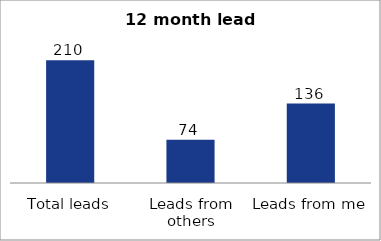
| Category | Series 0 |
|---|---|
| Total leads | 210 |
| Leads from others | 74 |
| Leads from me | 136 |